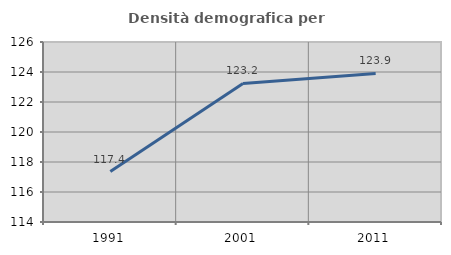
| Category | Densità demografica |
|---|---|
| 1991.0 | 117.365 |
| 2001.0 | 123.237 |
| 2011.0 | 123.906 |